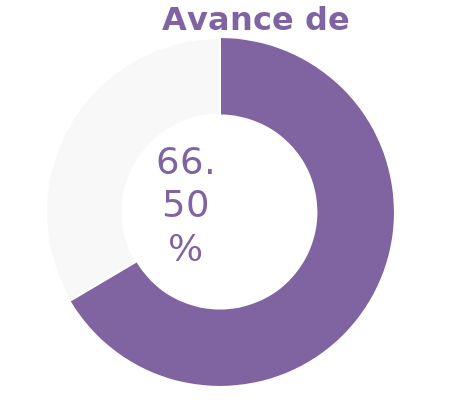
| Category | Series 0 |
|---|---|
| Acumulado 1 Trimestre | 0.665 |
| Año | -0.335 |